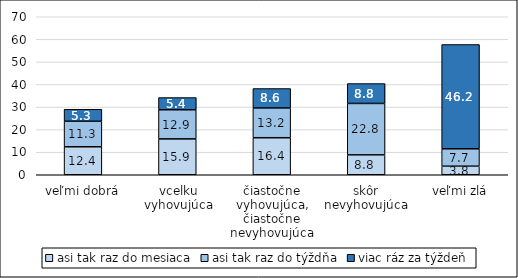
| Category | asi tak raz do mesiaca | asi tak raz do týždňa | viac ráz za týždeň |
|---|---|---|---|
| veľmi dobrá | 12.4 | 11.3 | 5.3 |
| vcelku vyhovujúca | 15.9 | 12.9 | 5.4 |
| čiastočne vyhovujúca, čiastočne nevyhovujúca | 16.4 | 13.2 | 8.6 |
| skôr nevyhovujúca | 8.8 | 22.8 | 8.8 |
| veľmi zlá | 3.8 | 7.7 | 46.2 |